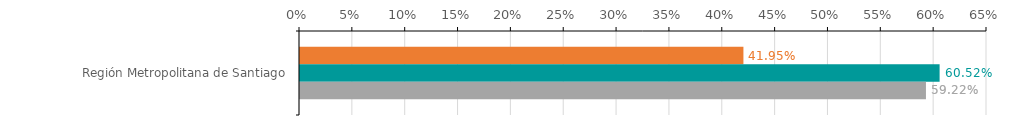
| Category | Numero de operaciones | Monto ($ MM) | Garantia ($ MM) |
|---|---|---|---|
| Región Metropolitana de Santiago | 0.42 | 0.605 | 0.592 |